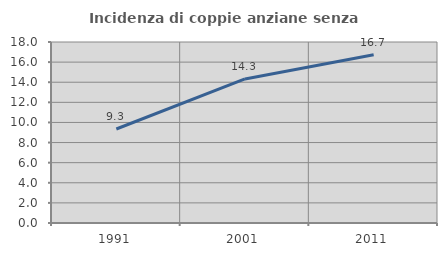
| Category | Incidenza di coppie anziane senza figli  |
|---|---|
| 1991.0 | 9.348 |
| 2001.0 | 14.328 |
| 2011.0 | 16.726 |